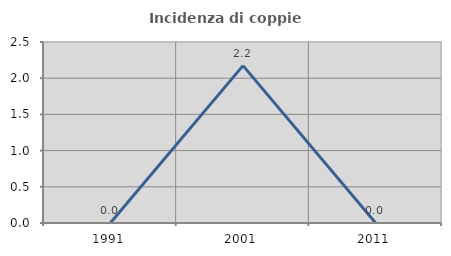
| Category | Incidenza di coppie miste |
|---|---|
| 1991.0 | 0 |
| 2001.0 | 2.174 |
| 2011.0 | 0 |